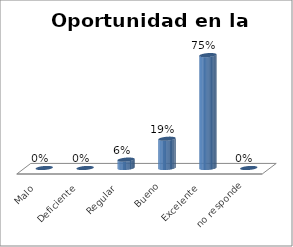
| Category | Series 0 |
|---|---|
| Malo | 0 |
| Deficiente | 0 |
| Regular  | 0.056 |
| Bueno | 0.194 |
| Excelente | 0.75 |
| no responde | 0 |